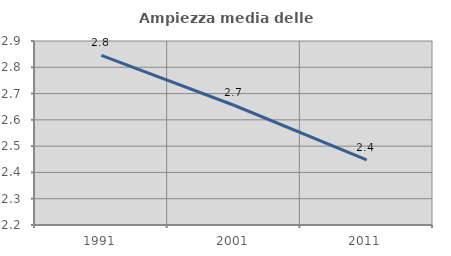
| Category | Ampiezza media delle famiglie |
|---|---|
| 1991.0 | 2.845 |
| 2001.0 | 2.656 |
| 2011.0 | 2.448 |